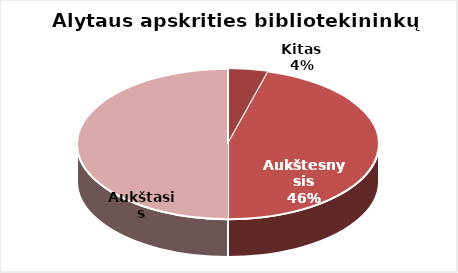
| Category | Series 0 |
|---|---|
| Kitas | 7 |
| Aukštesnysis | 74 |
| Aukštasis | 81 |